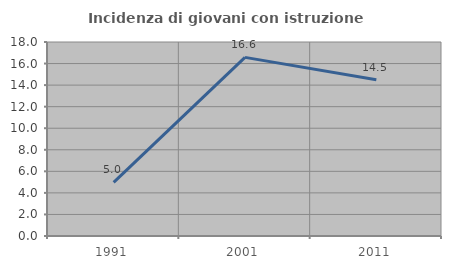
| Category | Incidenza di giovani con istruzione universitaria |
|---|---|
| 1991.0 | 4.972 |
| 2001.0 | 16.575 |
| 2011.0 | 14.493 |